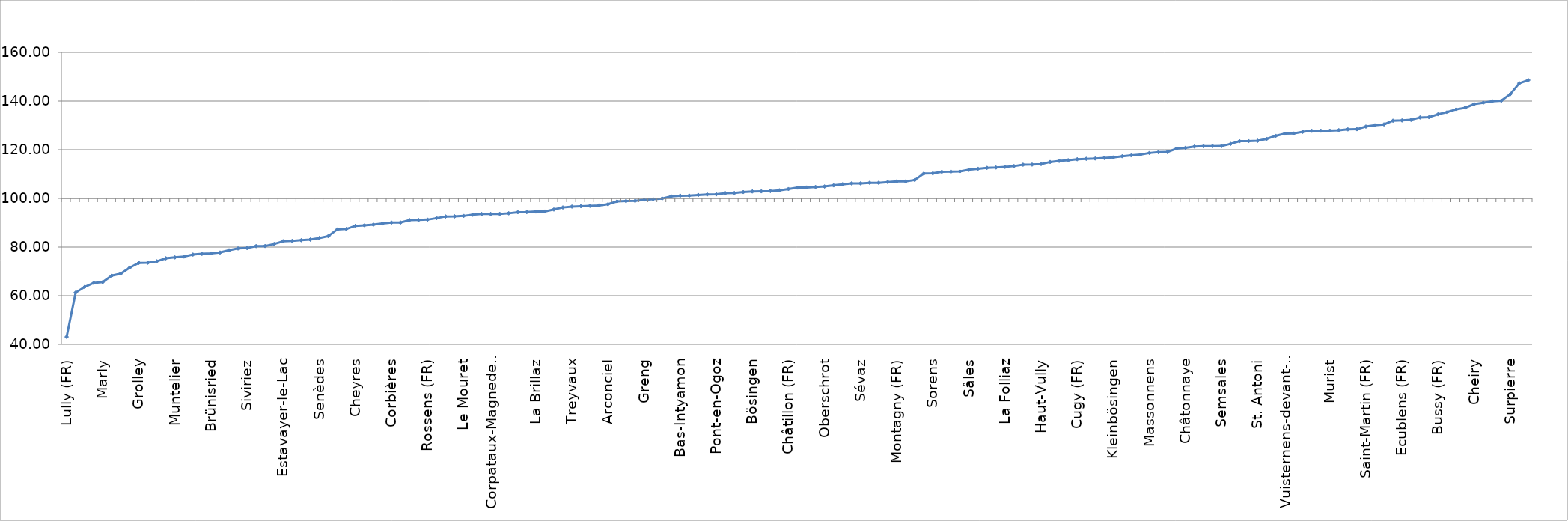
| Category | RCOM indices |
|---|---|
| Lully (FR) | 43.065 |
| Châtel-Saint-Denis | 61.28 |
| Villars-sur-Glâne | 63.602 |
| Wallenried | 65.244 |
| Marly | 65.6 |
| Fribourg | 68.243 |
| Corminboeuf | 69.066 |
| Bulle | 71.544 |
| Grolley | 73.478 |
| Granges-Paccot | 73.564 |
| Romont (FR) | 74.107 |
| Meyriez | 75.36 |
| Muntelier | 75.746 |
| Gruyères | 76.096 |
| Belfaux | 76.9 |
| Prez-vers-Noréaz | 77.195 |
| Brünisried | 77.385 |
| Courtepin | 77.746 |
| Vernay | 78.673 |
| Pont-la-Ville | 79.434 |
| Siviriez | 79.585 |
| Ferpicloz | 80.382 |
| Avry | 80.42 |
| Givisiez | 81.272 |
| Estavayer-le-Lac | 82.399 |
| Montet (Glâne) | 82.547 |
| Chénens | 82.821 |
| Matran | 83.074 |
| Senèdes | 83.713 |
| Gletterens | 84.476 |
| Cottens (FR) | 87.257 |
| Villeneuve (FR) | 87.432 |
| Cheyres | 88.711 |
| Crésuz | 88.948 |
| Hauterive (FR) | 89.226 |
| Giffers | 89.675 |
| Corbières | 90.068 |
| Neyruz (FR) | 90.09 |
| Botterens | 91.091 |
| Val-de-Charmey | 91.122 |
| Rossens (FR) | 91.275 |
| Tafers | 91.886 |
| Gurmels | 92.57 |
| Saint-Aubin (FR) | 92.626 |
| Le Mouret | 92.81 |
| Schmitten (FR) | 93.297 |
| Murten | 93.588 |
| Riaz | 93.61 |
| Corpataux-Magnedens | 93.646 |
| Villaz-Saint-Pierre | 93.884 |
| Le Pâquier (FR) | 94.315 |
| Ependes (FR) | 94.364 |
| La Brillaz | 94.593 |
| Corserey | 94.622 |
| Châtel-sur-Montsalvens | 95.442 |
| Granges (Veveyse) | 96.272 |
| Treyvaux | 96.647 |
| Vuadens | 96.79 |
| Vuisternens-en-Ogoz | 96.932 |
| Villarsel-sur-Marly | 97.106 |
| Arconciel | 97.612 |
| St. Silvester | 98.782 |
| Nuvilly | 98.911 |
| Marsens | 98.969 |
| Greng | 99.378 |
| Düdingen | 99.728 |
| Kerzers | 99.955 |
| La Sonnaz | 100.877 |
| Bas-Intyamon | 101.106 |
| Domdidier | 101.144 |
| Plasselb | 101.418 |
| Bossonnens | 101.63 |
| Pont-en-Ogoz | 101.661 |
| Broc | 102.144 |
| Remaufens | 102.201 |
| Delley-Portalban | 102.598 |
| Bösingen | 102.854 |
| La Roche | 102.903 |
| Ursy | 103.03 |
| Wünnewil-Flamatt | 103.318 |
| Châtillon (FR) | 103.862 |
| Ponthaux | 104.43 |
| Tentlingen | 104.499 |
| Le Glèbe | 104.723 |
| Oberschrot | 104.896 |
| Vuissens | 105.359 |
| Morlon | 105.798 |
| Bas-Vully | 106.161 |
| Sévaz | 106.186 |
| Chésopelloz | 106.418 |
| Noréaz | 106.421 |
| Farvagny | 106.724 |
| Montagny (FR) | 106.992 |
| Courgevaux | 107 |
| Léchelles | 107.556 |
| Cressier (FR) | 110.201 |
| Sorens | 110.291 |
| Pierrafortscha | 110.919 |
| Attalens | 110.964 |
| Salvenach | 111.097 |
| Sâles | 111.745 |
| Torny | 112.168 |
| Villarepos | 112.535 |
| Le Flon | 112.697 |
| La Folliaz | 112.947 |
| Mézières (FR) | 113.267 |
| Vaulruz | 113.833 |
| Villorsonnens | 113.893 |
| Haut-Vully | 114.108 |
| Misery-Courtion | 114.956 |
| Jeuss | 115.414 |
| Rue | 115.667 |
| Cugy (FR) | 116.084 |
| Grandvillard | 116.266 |
| Fétigny | 116.402 |
| Autigny | 116.624 |
| Kleinbösingen | 116.823 |
| Dompierre (FR) | 117.33 |
| La Verrerie | 117.68 |
| Rechthalten | 117.996 |
| Massonnens | 118.655 |
| Auboranges | 118.982 |
| Hauteville | 119.064 |
| Les Montets | 120.454 |
| Châtonnaye | 120.794 |
| Zumholz | 121.305 |
| Vallon | 121.44 |
| Echarlens | 121.487 |
| Semsales | 121.512 |
| Ulmiz | 122.412 |
| Châbles | 123.511 |
| Courlevon | 123.55 |
| St. Antoni | 123.682 |
| Haut-Intyamon | 124.467 |
| Chapelle (Glâne) | 125.712 |
| St. Ursen | 126.603 |
| Vuisternens-devant-Romont | 126.671 |
| Alterswil | 127.378 |
| Barberêche | 127.776 |
| Ueberstorf | 127.81 |
| Murist | 127.842 |
| Ried bei Kerzers | 128.029 |
| Plaffeien | 128.376 |
| Fräschels | 128.433 |
| Saint-Martin (FR) | 129.518 |
| Jaun | 130.044 |
| Morens (FR) | 130.411 |
| Rueyres-les-Prés | 131.93 |
| Ecublens (FR) | 132.049 |
| Galmiz | 132.281 |
| Billens-Hennens | 133.267 |
| Autafond | 133.376 |
| Bussy (FR) | 134.585 |
| Heitenried | 135.455 |
| Prévondavaux | 136.575 |
| Gempenach | 137.253 |
| Cheiry | 138.762 |
| Lurtigen | 139.312 |
| Ménières | 139.955 |
| Grangettes | 140.15 |
| Surpierre | 142.853 |
| Russy | 147.336 |
| Le Châtelard | 148.62 |